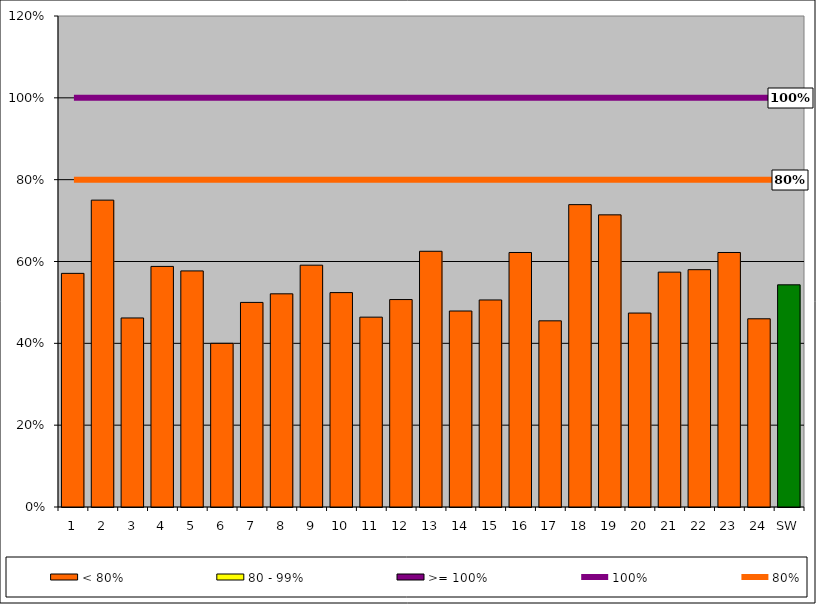
| Category | < 80% | 80 - 99% | >= 100% |
|---|---|---|---|
| 1 | 0.571 | 0 | 0 |
| 2 | 0.75 | 0 | 0 |
| 3 | 0.462 | 0 | 0 |
| 4 | 0.588 | 0 | 0 |
| 5 | 0.577 | 0 | 0 |
| 6 | 0.4 | 0 | 0 |
| 7 | 0.5 | 0 | 0 |
| 8 | 0.521 | 0 | 0 |
| 9 | 0.591 | 0 | 0 |
| 10 | 0.524 | 0 | 0 |
| 11 | 0.464 | 0 | 0 |
| 12 | 0.507 | 0 | 0 |
| 13 | 0.625 | 0 | 0 |
| 14 | 0.479 | 0 | 0 |
| 15 | 0.506 | 0 | 0 |
| 16 | 0.622 | 0 | 0 |
| 17 | 0.455 | 0 | 0 |
| 18 | 0.739 | 0 | 0 |
| 19 | 0.714 | 0 | 0 |
| 20 | 0.474 | 0 | 0 |
| 21 | 0.574 | 0 | 0 |
| 22 | 0.58 | 0 | 0 |
| 23 | 0.622 | 0 | 0 |
| 24 | 0.46 | 0 | 0 |
| SW | 0.543 | 0 | 0 |